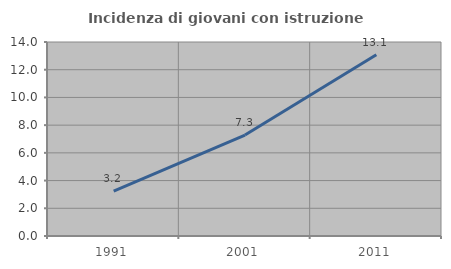
| Category | Incidenza di giovani con istruzione universitaria |
|---|---|
| 1991.0 | 3.243 |
| 2001.0 | 7.285 |
| 2011.0 | 13.081 |